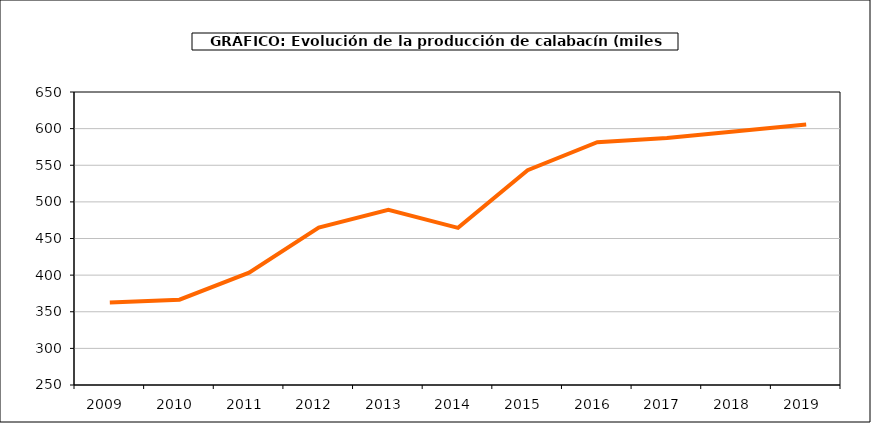
| Category | producción |
|---|---|
| 2009.0 | 362.773 |
| 2010.0 | 366.498 |
| 2011.0 | 403.38 |
| 2012.0 | 465.039 |
| 2013.0 | 489.297 |
| 2014.0 | 464.496 |
| 2015.0 | 543.195 |
| 2016.0 | 581.503 |
| 2017.0 | 587.174 |
| 2018.0 | 596.315 |
| 2019.0 | 605.527 |